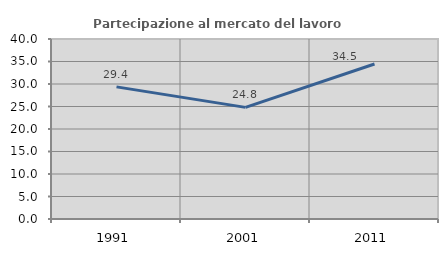
| Category | Partecipazione al mercato del lavoro  femminile |
|---|---|
| 1991.0 | 29.358 |
| 2001.0 | 24.806 |
| 2011.0 | 34.454 |